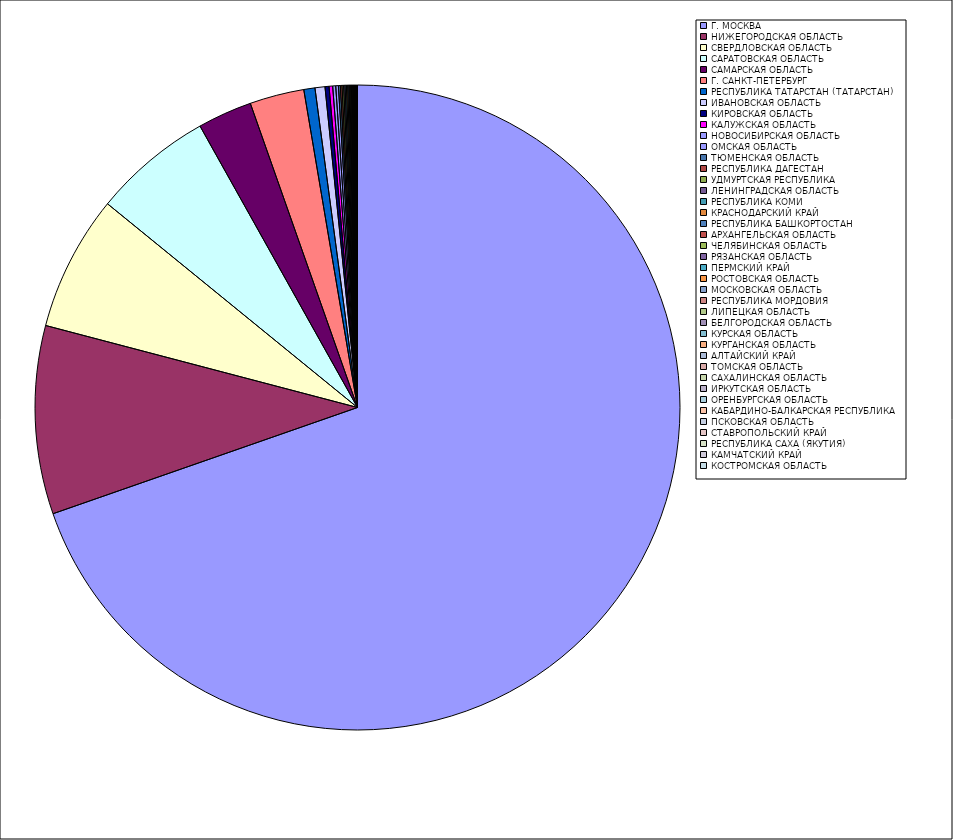
| Category | Оборот |
|---|---|
| Г. МОСКВА | 69.639 |
| НИЖЕГОРОДСКАЯ ОБЛАСТЬ | 9.433 |
| СВЕРДЛОВСКАЯ ОБЛАСТЬ | 6.787 |
| САРАТОВСКАЯ ОБЛАСТЬ | 5.997 |
| САМАРСКАЯ ОБЛАСТЬ | 2.727 |
| Г. САНКТ-ПЕТЕРБУРГ | 2.726 |
| РЕСПУБЛИКА ТАТАРСТАН (ТАТАРСТАН) | 0.557 |
| ИВАНОВСКАЯ ОБЛАСТЬ | 0.5 |
| КИРОВСКАЯ ОБЛАСТЬ | 0.201 |
| КАЛУЖСКАЯ ОБЛАСТЬ | 0.179 |
| НОВОСИБИРСКАЯ ОБЛАСТЬ | 0.151 |
| ОМСКАЯ ОБЛАСТЬ | 0.133 |
| ТЮМЕНСКАЯ ОБЛАСТЬ | 0.095 |
| РЕСПУБЛИКА ДАГЕСТАН | 0.081 |
| УДМУРТСКАЯ РЕСПУБЛИКА | 0.081 |
| ЛЕНИНГРАДСКАЯ ОБЛАСТЬ | 0.07 |
| РЕСПУБЛИКА КОМИ | 0.069 |
| КРАСНОДАРСКИЙ КРАЙ | 0.062 |
| РЕСПУБЛИКА БАШКОРТОСТАН | 0.058 |
| АРХАНГЕЛЬСКАЯ ОБЛАСТЬ | 0.045 |
| ЧЕЛЯБИНСКАЯ ОБЛАСТЬ | 0.044 |
| РЯЗАНСКАЯ ОБЛАСТЬ | 0.037 |
| ПЕРМСКИЙ КРАЙ | 0.036 |
| РОСТОВСКАЯ ОБЛАСТЬ | 0.027 |
| МОСКОВСКАЯ ОБЛАСТЬ | 0.025 |
| РЕСПУБЛИКА МОРДОВИЯ | 0.025 |
| ЛИПЕЦКАЯ ОБЛАСТЬ | 0.024 |
| БЕЛГОРОДСКАЯ ОБЛАСТЬ | 0.02 |
| КУРСКАЯ ОБЛАСТЬ | 0.018 |
| КУРГАНСКАЯ ОБЛАСТЬ | 0.015 |
| АЛТАЙСКИЙ КРАЙ | 0.015 |
| ТОМСКАЯ ОБЛАСТЬ | 0.015 |
| САХАЛИНСКАЯ ОБЛАСТЬ | 0.011 |
| ИРКУТСКАЯ ОБЛАСТЬ | 0.011 |
| ОРЕНБУРГСКАЯ ОБЛАСТЬ | 0.011 |
| КАБАРДИНО-БАЛКАРСКАЯ РЕСПУБЛИКА | 0.01 |
| ПСКОВСКАЯ ОБЛАСТЬ | 0.009 |
| СТАВРОПОЛЬСКИЙ КРАЙ | 0.009 |
| РЕСПУБЛИКА САХА (ЯКУТИЯ) | 0.008 |
| КАМЧАТСКИЙ КРАЙ | 0.006 |
| КОСТРОМСКАЯ ОБЛАСТЬ | 0.006 |